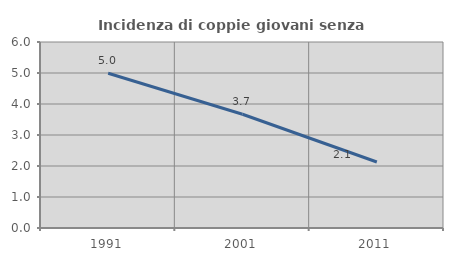
| Category | Incidenza di coppie giovani senza figli |
|---|---|
| 1991.0 | 4.993 |
| 2001.0 | 3.67 |
| 2011.0 | 2.129 |